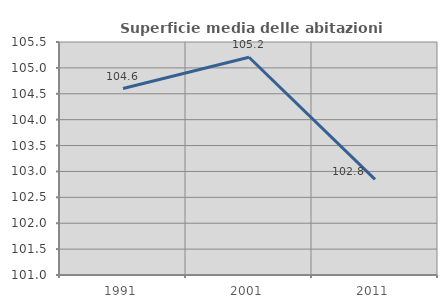
| Category | Superficie media delle abitazioni occupate |
|---|---|
| 1991.0 | 104.601 |
| 2001.0 | 105.206 |
| 2011.0 | 102.846 |